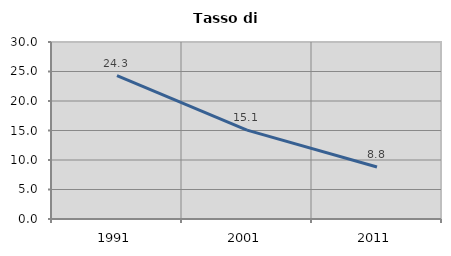
| Category | Tasso di disoccupazione   |
|---|---|
| 1991.0 | 24.32 |
| 2001.0 | 15.058 |
| 2011.0 | 8.824 |